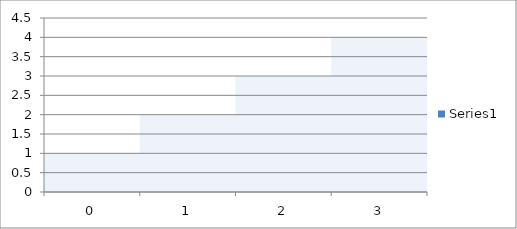
| Category | Series 0 |
|---|---|
| 0.0 | 1 |
| 1.0 | 2 |
| 2.0 | 3 |
| 3.0 | 4 |